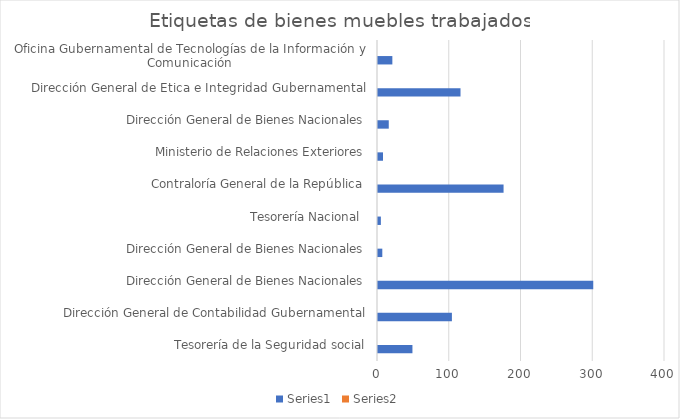
| Category | Series 0 | Series 1 |
|---|---|---|
| Tesorería de la Seguridad social | 48 | 0 |
| Dirección General de Contabilidad Gubernamental | 103 | 0 |
| Dirección General de Bienes Nacionales | 300 | 0 |
| Dirección General de Bienes Nacionales | 6 | 0 |
| Tesorería Nacional | 4 | 0 |
| Contraloría General de la República | 175 | 0 |
| Ministerio de Relaciones Exteriores | 7 | 0 |
| Dirección General de Bienes Nacionales | 15 | 0 |
| Dirección General de Etica e Integridad Gubernamental | 115 | 0 |
| Oficina Gubernamental de Tecnologías de la Información y Comunicación  | 20 | 0 |